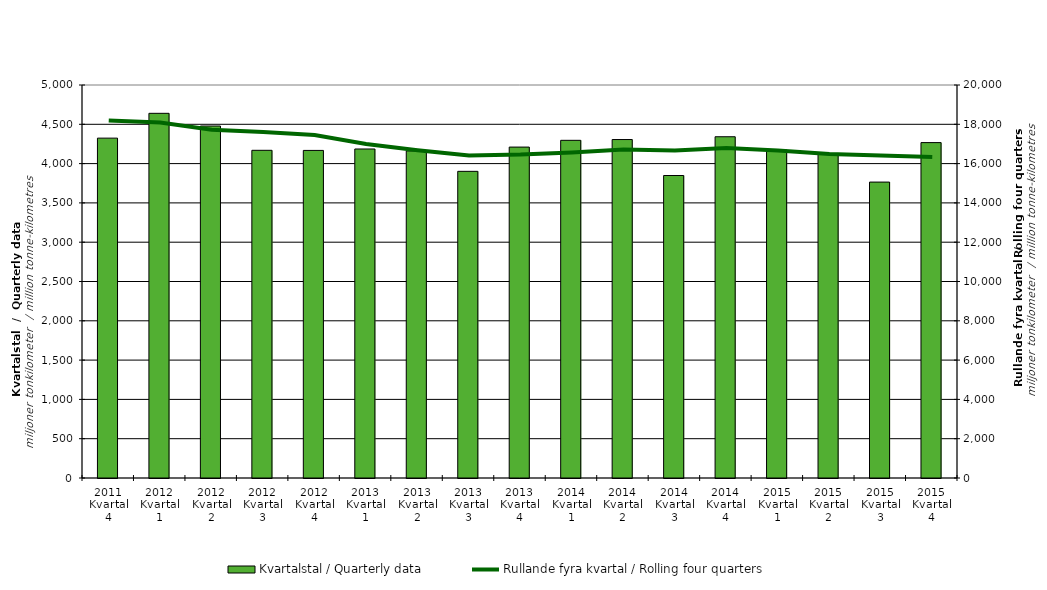
| Category | Kvartalstal / Quarterly data |
|---|---|
| 2011 Kvartal 4 | 4324.021 |
| 2012 Kvartal 1 | 4639.605 |
| 2012 Kvartal 2 | 4478.181 |
| 2012 Kvartal 3 | 4169.211 |
| 2012 Kvartal 4 | 4167.699 |
| 2013 Kvartal 1 | 4185.837 |
| 2013 Kvartal 2 | 4161.615 |
| 2013 Kvartal 3 | 3901.557 |
| 2013 Kvartal 4 | 4210.16 |
| 2014 Kvartal 1 | 4296.225 |
| 2014 Kvartal 2 | 4306.168 |
| 2014 Kvartal 3 | 3848.435 |
| 2014 Kvartal 4 | 4341.663 |
| 2015 Kvartal 1 | 4174.772 |
| 2015 Kvartal 2 | 4128.978 |
| 2015 Kvartal 3 | 3764.741 |
| 2015 Kvartal 4 | 4267.186 |